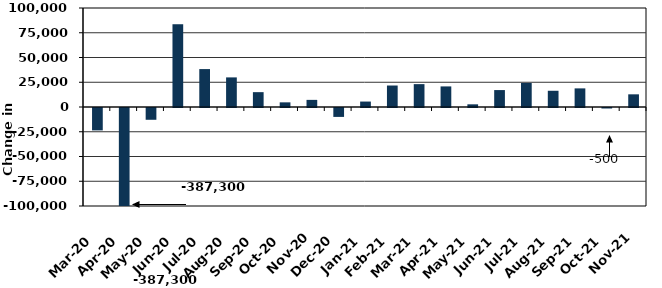
| Category | Series 0 |
|---|---|
| 2020-03-01 | -22600 |
| 2020-04-01 | -387300 |
| 2020-05-01 | -11900 |
| 2020-06-01 | 83600 |
| 2020-07-01 | 38300 |
| 2020-08-01 | 29900 |
| 2020-09-01 | 15000 |
| 2020-10-01 | 4700 |
| 2020-11-01 | 7200 |
| 2020-12-01 | -9000 |
| 2021-01-01 | 5500 |
| 2021-02-01 | 21700 |
| 2021-03-01 | 23100 |
| 2021-04-01 | 20800 |
| 2021-05-01 | 2700 |
| 2021-06-01 | 17100 |
| 2021-07-01 | 24300 |
| 2021-08-01 | 16400 |
| 2021-09-01 | 18800 |
| 2021-10-01 | -500 |
| 2021-11-01 | 12800 |